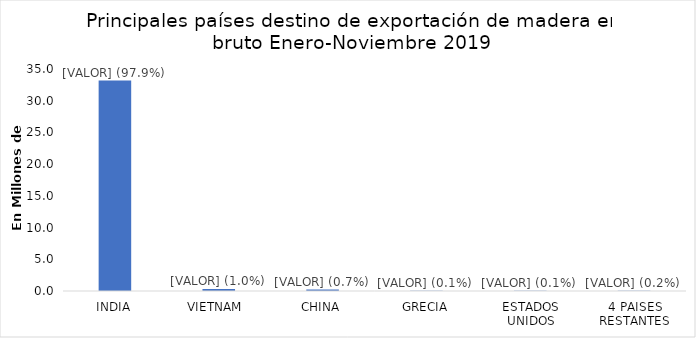
| Category | Series 0 |
|---|---|
| INDIA | 33169214 |
| VIETNAM  | 323417 |
| CHINA | 229200 |
| GRECIA | 49410 |
| ESTADOS UNIDOS | 35669 |
| 4 PAISES RESTANTES | 56742 |